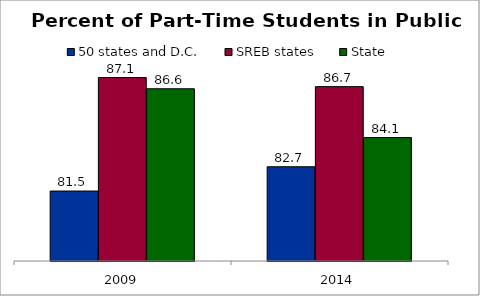
| Category | 50 states and D.C. | SREB states | State |
|---|---|---|---|
| 2009 | 81.481 | 87.128 | 86.569 |
| 2014 | 82.688 | 86.675 | 84.141 |